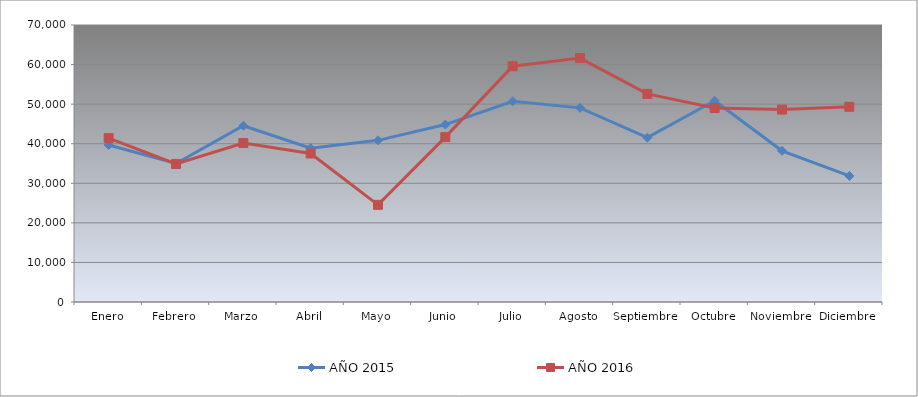
| Category | AÑO 2015 | AÑO 2016 |
|---|---|---|
| Enero | 39682.465 | 41416.326 |
| Febrero | 35007.814 | 34889.718 |
| Marzo | 44543.443 | 40173.598 |
| Abril | 38856.774 | 37523.422 |
| Mayo | 40853.411 | 24552.566 |
| Junio | 44839.377 | 41667.068 |
| Julio | 50706.894 | 59581.381 |
| Agosto | 49062.82 | 61640.393 |
| Septiembre | 41527.481 | 52597.215 |
| Octubre | 50876.781 | 49022.771 |
| Noviembre | 38210.105 | 48620.12 |
| Diciembre | 31854.846 | 49330.251 |